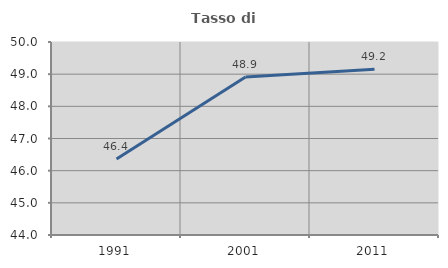
| Category | Tasso di occupazione   |
|---|---|
| 1991.0 | 46.362 |
| 2001.0 | 48.915 |
| 2011.0 | 49.153 |